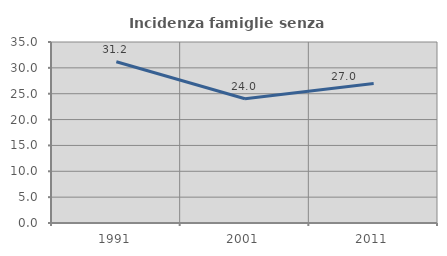
| Category | Incidenza famiglie senza nuclei |
|---|---|
| 1991.0 | 31.169 |
| 2001.0 | 24.038 |
| 2011.0 | 26.957 |